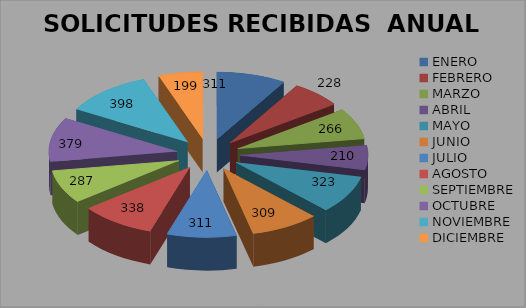
| Category | SOLICITUDES RECIBIDAS  ANUAL 2014 |
|---|---|
| ENERO | 311 |
| FEBRERO | 228 |
| MARZO | 266 |
| ABRIL | 210 |
| MAYO | 323 |
| JUNIO | 309 |
| JULIO | 311 |
| AGOSTO | 338 |
| SEPTIEMBRE | 287 |
| OCTUBRE | 379 |
| NOVIEMBRE | 398 |
| DICIEMBRE | 199 |